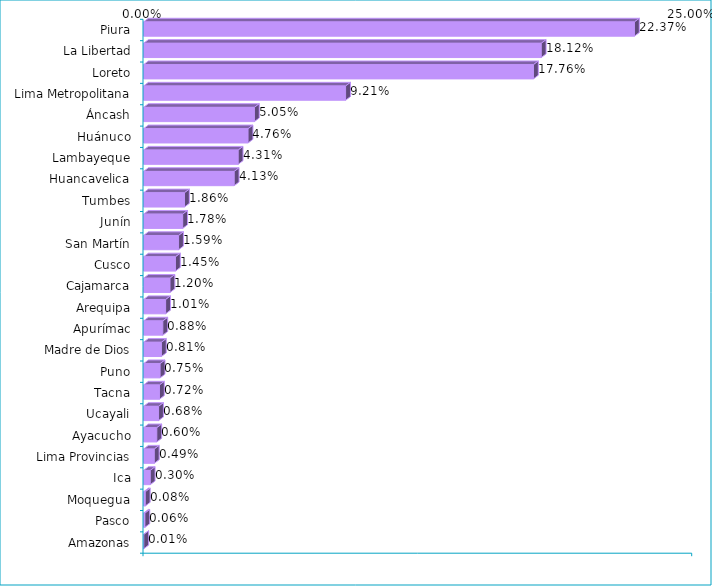
| Category | Series 0 |
|---|---|
| Piura | 0.224 |
| La Libertad | 0.181 |
| Loreto | 0.178 |
| Lima Metropolitana | 0.092 |
| Áncash | 0.05 |
| Huánuco | 0.048 |
| Lambayeque | 0.043 |
| Huancavelica | 0.041 |
| Tumbes | 0.019 |
| Junín | 0.018 |
| San Martín | 0.016 |
| Cusco | 0.015 |
| Cajamarca | 0.012 |
| Arequipa | 0.01 |
| Apurímac | 0.009 |
| Madre de Dios | 0.008 |
| Puno | 0.008 |
| Tacna | 0.007 |
| Ucayali | 0.007 |
| Ayacucho | 0.006 |
| Lima Provincias | 0.005 |
| Ica | 0.003 |
| Moquegua | 0.001 |
| Pasco | 0.001 |
| Amazonas | 0 |